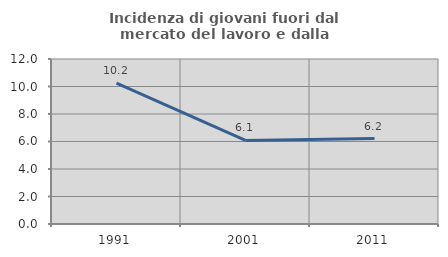
| Category | Incidenza di giovani fuori dal mercato del lavoro e dalla formazione  |
|---|---|
| 1991.0 | 10.247 |
| 2001.0 | 6.081 |
| 2011.0 | 6.214 |